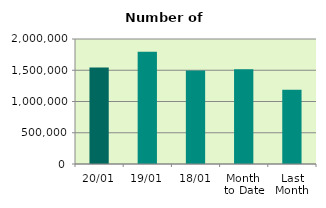
| Category | Series 0 |
|---|---|
| 20/01 | 1544678 |
| 19/01 | 1794536 |
| 18/01 | 1497888 |
| Month 
to Date | 1516271.571 |
| Last
Month | 1187425.652 |